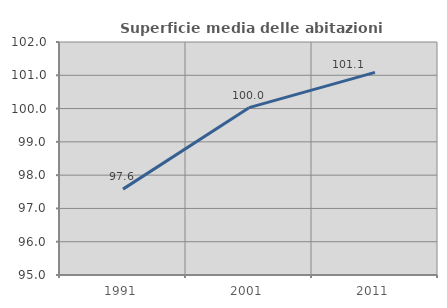
| Category | Superficie media delle abitazioni occupate |
|---|---|
| 1991.0 | 97.58 |
| 2001.0 | 100.028 |
| 2011.0 | 101.088 |